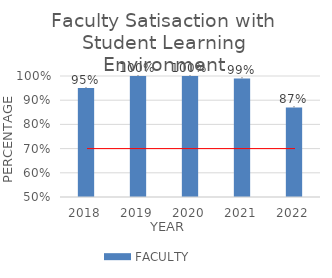
| Category | FACULTY SATISFACTION |
|---|---|
| 0 | 0.95 |
| 1 | 1 |
| 2 | 1 |
| 3 | 0.99 |
| 4 | 0.87 |